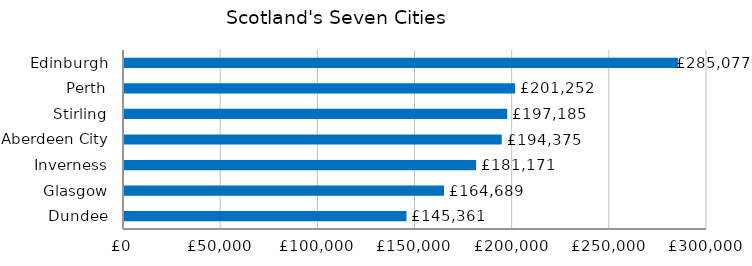
| Category | Series 0 |
|---|---|
| Dundee | 145360.547 |
| Glasgow | 164689.209 |
| Inverness | 181170.694 |
| Aberdeen City | 194375.192 |
| Stirling | 197184.534 |
| Perth | 201252.372 |
| Edinburgh | 285077.279 |